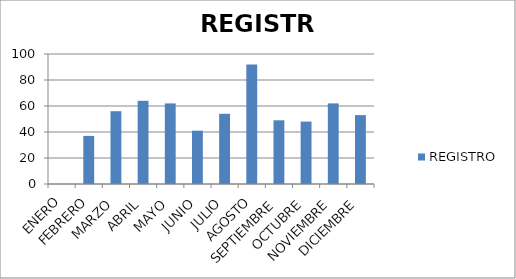
| Category | REGISTRO |
|---|---|
| ENERO | 0 |
| FEBRERO | 37 |
| MARZO | 56 |
| ABRIL | 64 |
| MAYO | 62 |
| JUNIO | 41 |
| JULIO | 54 |
| AGOSTO | 92 |
| SEPTIEMBRE | 49 |
| OCTUBRE | 48 |
| NOVIEMBRE | 62 |
| DICIEMBRE | 53 |